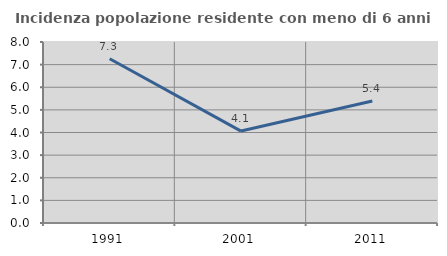
| Category | Incidenza popolazione residente con meno di 6 anni |
|---|---|
| 1991.0 | 7.258 |
| 2001.0 | 4.063 |
| 2011.0 | 5.39 |